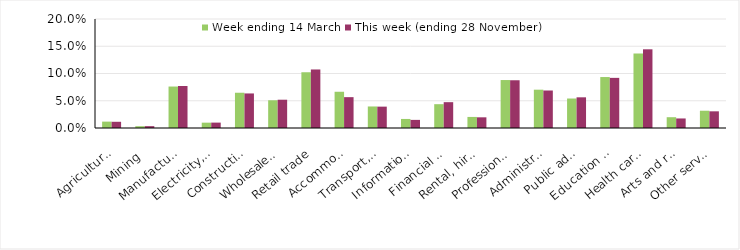
| Category | Week ending 14 March | This week (ending 28 November) |
|---|---|---|
| Agriculture, forestry and fishing | 0.012 | 0.011 |
| Mining | 0.003 | 0.003 |
| Manufacturing | 0.076 | 0.077 |
| Electricity, gas, water and waste services | 0.01 | 0.01 |
| Construction | 0.065 | 0.063 |
| Wholesale trade | 0.051 | 0.052 |
| Retail trade | 0.102 | 0.107 |
| Accommodation and food services | 0.066 | 0.057 |
| Transport, postal and warehousing | 0.04 | 0.039 |
| Information media and telecommunications | 0.017 | 0.015 |
| Financial and insurance services | 0.044 | 0.047 |
| Rental, hiring and real estate services | 0.02 | 0.02 |
| Professional, scientific and technical services | 0.088 | 0.088 |
| Administrative and support services | 0.07 | 0.069 |
| Public administration and safety | 0.054 | 0.056 |
| Education and training | 0.094 | 0.092 |
| Health care and social assistance | 0.137 | 0.144 |
| Arts and recreation services | 0.02 | 0.018 |
| Other services | 0.032 | 0.031 |